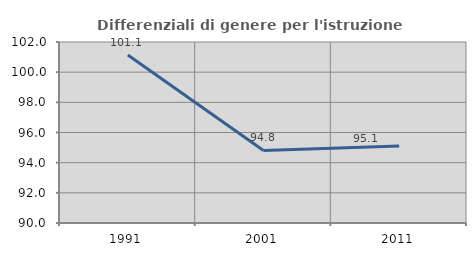
| Category | Differenziali di genere per l'istruzione superiore |
|---|---|
| 1991.0 | 101.14 |
| 2001.0 | 94.808 |
| 2011.0 | 95.107 |